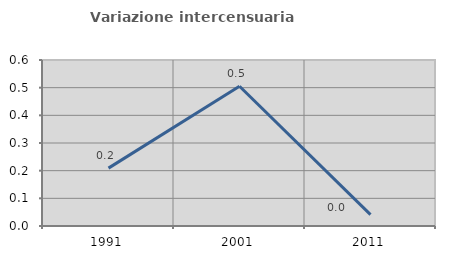
| Category | Variazione intercensuaria annua |
|---|---|
| 1991.0 | 0.209 |
| 2001.0 | 0.505 |
| 2011.0 | 0.041 |